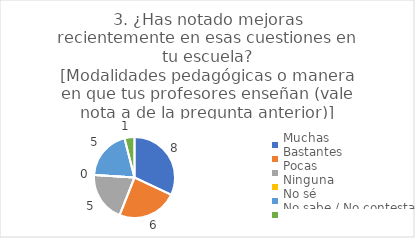
| Category | 3. ¿Has notado mejoras recientemente en esas cuestiones en tu escuela?
[Modalidades pedagógicas o manera en que tus profesores enseñan (vale nota a de la pregunta anterior)] |
|---|---|
| Muchas  | 0.32 |
| Bastantes  | 0.24 |
| Pocas  | 0.2 |
| Ninguna  | 0 |
| No sé  | 0.2 |
| No sabe / No contesta | 0.04 |